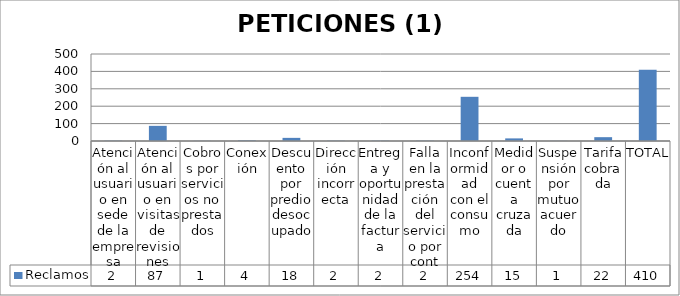
| Category | Reclamos |
|---|---|
| Atención al usuario en sede de la empresa | 2 |
| Atención al usuario en visitas de revisiones | 87 |
| Cobros por servicios no prestados | 1 |
| Conexión | 4 |
| Descuento por predio desocupado | 18 |
| Dirección incorrecta | 2 |
| Entrega y oportunidad de la factura | 2 |
| Falla en la prestación del servicio por cont | 2 |
| Inconformidad con el consumo | 254 |
| Medidor o cuenta cruzada | 15 |
| Suspensión por mutuo acuerdo | 1 |
| Tarifa cobrada | 22 |
| TOTAL | 410 |